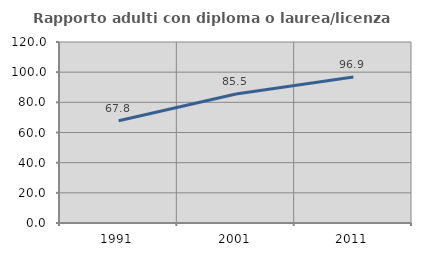
| Category | Rapporto adulti con diploma o laurea/licenza media  |
|---|---|
| 1991.0 | 67.754 |
| 2001.0 | 85.505 |
| 2011.0 | 96.858 |